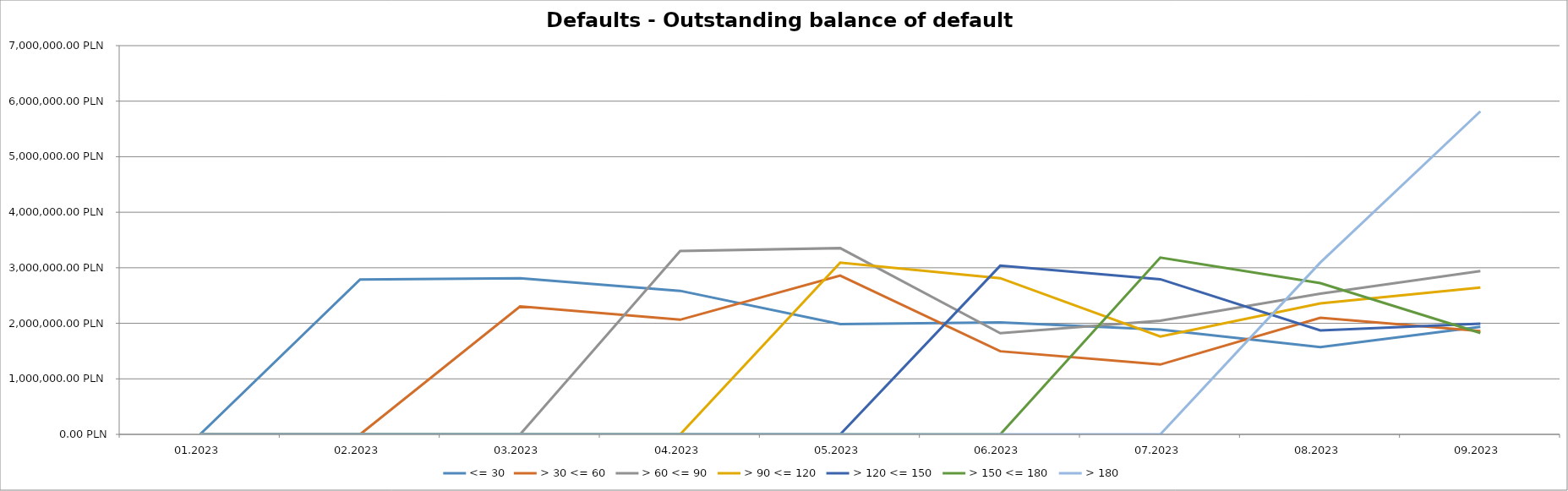
| Category | <= 30 | > 30 <= 60 | > 60 <= 90 | > 90 <= 120 | > 120 <= 150 | > 150 <= 180 | > 180 |
|---|---|---|---|---|---|---|---|
| 01.2023 | 0 | 0 | 0 | 0 | 0 | 0 | 0 |
| 02.2023 | 2788519.82 | 0 | 0 | 0 | 0 | 0 | 0 |
| 03.2023 | 2811517.14 | 2305154.07 | 0 | 0 | 0 | 0 | 0 |
| 04.2023 | 2584791.3 | 2064675.87 | 3301101.31 | 0 | 0 | 0 | 0 |
| 05.2023 | 1985441.56 | 2858398.5 | 3353485.78 | 3091988.77 | 0 | 0 | 0 |
| 06.2023 | 2016845.02 | 1496657.8 | 1822162.63 | 2812422.86 | 3037767.68 | 0 | 0 |
| 07.2023 | 1886118.05 | 1257979.4 | 2047168.21 | 1762916.26 | 2793763.11 | 3184053.47 | 0 |
| 08.2023 | 1572650.17 | 2099798.77 | 2534461.69 | 2357426.74 | 1871124.51 | 2723545.23 | 3093972.9 |
| 09.2023 | 1936023.84 | 1858916.55 | 2940706.37 | 2644290.89 | 1991761.95 | 1826544.8 | 5816448.05 |